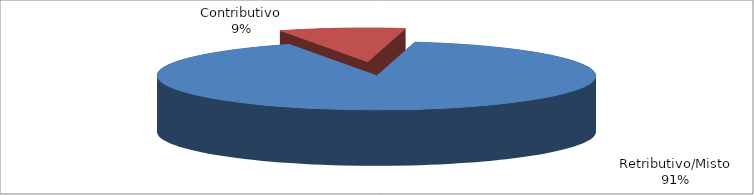
| Category | Series 1 |
|---|---|
| Retributivo/Misto | 341760 |
| Contributivo | 34993 |